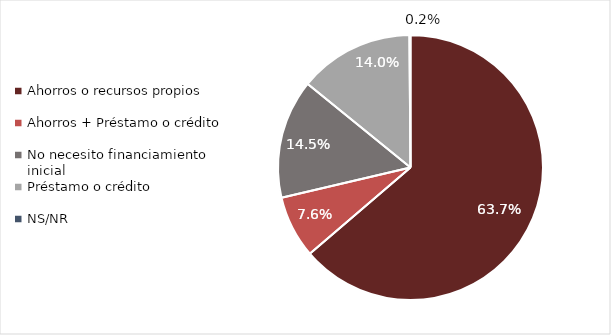
| Category | % |
|---|---|
| Ahorros o recursos propios | 0.637 |
| Ahorros + Préstamo o crédito | 0.076 |
| No necesito financiamiento inicial | 0.145 |
| Préstamo o crédito | 0.14 |
| NS/NR | 0.001 |